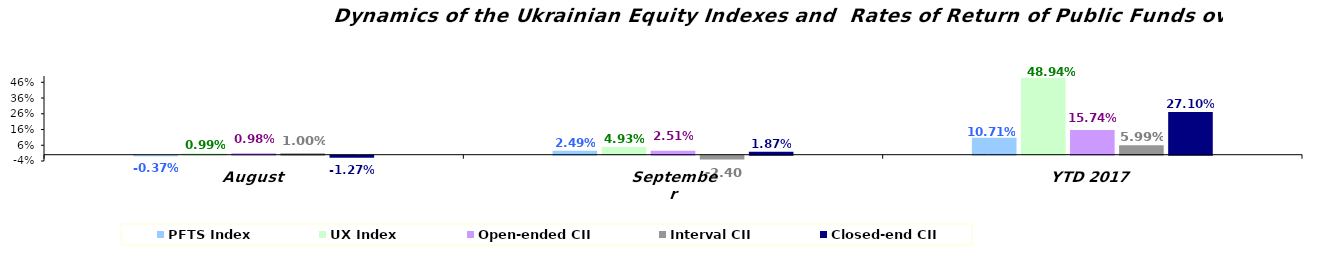
| Category | PFTS Index | UX Index | Open-ended CII | Interval CII | Closed-end CII |
|---|---|---|---|---|---|
| August | -0.004 | 0.01 | 0.01 | 0.01 | -0.013 |
| September | 0.025 | 0.049 | 0.025 | -0.024 | 0.019 |
| YTD 2017 | 0.107 | 0.489 | 0.157 | 0.06 | 0.271 |